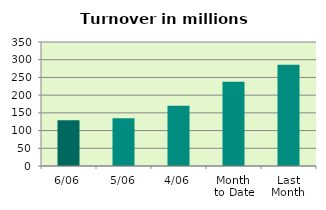
| Category | Series 0 |
|---|---|
| 6/06 | 128.995 |
| 5/06 | 135.13 |
| 4/06 | 169.718 |
| Month 
to Date | 237.794 |
| Last
Month | 285.992 |